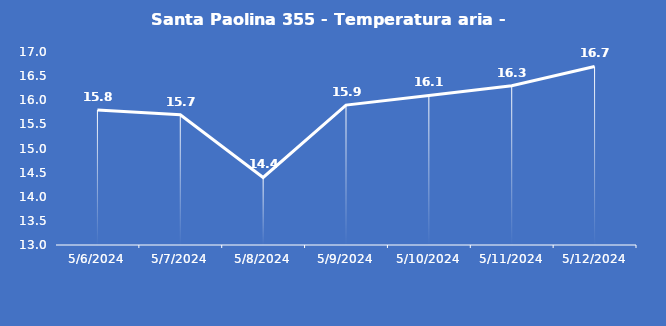
| Category | Santa Paolina 355 - Temperatura aria - Grezzo (°C) |
|---|---|
| 5/6/24 | 15.8 |
| 5/7/24 | 15.7 |
| 5/8/24 | 14.4 |
| 5/9/24 | 15.9 |
| 5/10/24 | 16.1 |
| 5/11/24 | 16.3 |
| 5/12/24 | 16.7 |